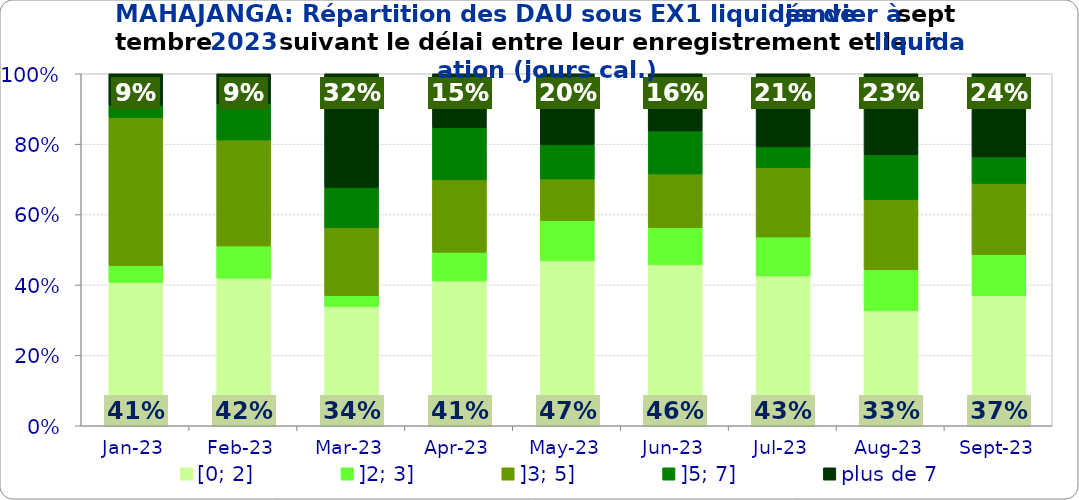
| Category | [0; 2] | ]2; 3] | ]3; 5] | ]5; 7] | plus de 7 |
|---|---|---|---|---|---|
| 2023-01-01 | 0.407 | 0.048 | 0.421 | 0.034 | 0.09 |
| 2023-02-01 | 0.419 | 0.091 | 0.301 | 0.102 | 0.086 |
| 2023-03-01 | 0.339 | 0.031 | 0.193 | 0.115 | 0.323 |
| 2023-04-01 | 0.411 | 0.081 | 0.206 | 0.148 | 0.153 |
| 2023-05-01 | 0.469 | 0.114 | 0.118 | 0.098 | 0.201 |
| 2023-06-01 | 0.458 | 0.105 | 0.153 | 0.122 | 0.163 |
| 2023-07-01 | 0.426 | 0.111 | 0.197 | 0.059 | 0.208 |
| 2023-08-01 | 0.326 | 0.117 | 0.199 | 0.127 | 0.23 |
| 2023-09-01 | 0.37 | 0.116 | 0.202 | 0.075 | 0.236 |